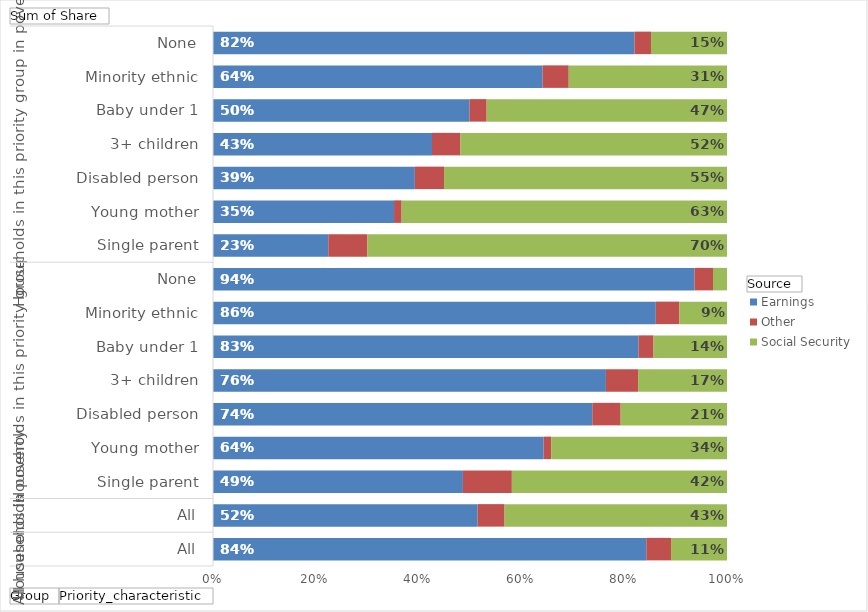
| Category | Earnings | Other | Social Security |
|---|---|---|---|
| 0 | 0.843 | 0.048 | 0.109 |
| 1 | 0.516 | 0.053 | 0.434 |
| 2 | 0.487 | 0.095 | 0.419 |
| 3 | 0.643 | 0.015 | 0.342 |
| 4 | 0.738 | 0.055 | 0.207 |
| 5 | 0.765 | 0.063 | 0.173 |
| 6 | 0.828 | 0.029 | 0.143 |
| 7 | 0.862 | 0.046 | 0.093 |
| 8 | 0.937 | 0.036 | 0.027 |
| 9 | 0.225 | 0.076 | 0.702 |
| 10 | 0.352 | 0.015 | 0.633 |
| 11 | 0.393 | 0.057 | 0.55 |
| 12 | 0.426 | 0.055 | 0.519 |
| 13 | 0.499 | 0.033 | 0.468 |
| 14 | 0.641 | 0.051 | 0.308 |
| 15 | 0.823 | 0.032 | 0.148 |